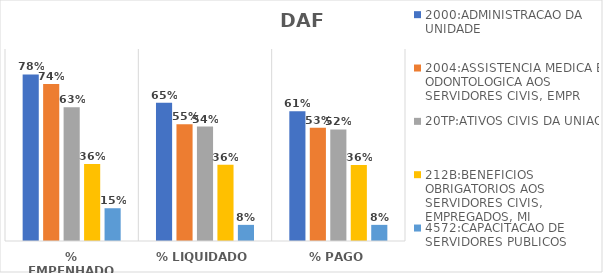
| Category | 2000:ADMINISTRACAO DA UNIDADE | 2004:ASSISTENCIA MEDICA E ODONTOLOGICA AOS SERVIDORES CIVIS, EMPR | 20TP:ATIVOS CIVIS DA UNIAO | 212B:BENEFICIOS OBRIGATORIOS AOS SERVIDORES CIVIS, EMPREGADOS, MI | 4572:CAPACITACAO DE SERVIDORES PUBLICOS FEDERAIS EM PROCESSO DE Q |
|---|---|---|---|---|---|
| % EMPENHADO | 0.781 | 0.736 | 0.627 | 0.361 | 0.154 |
| % LIQUIDADO | 0.648 | 0.547 | 0.536 | 0.357 | 0.076 |
| % PAGO | 0.609 | 0.53 | 0.523 | 0.356 | 0.076 |